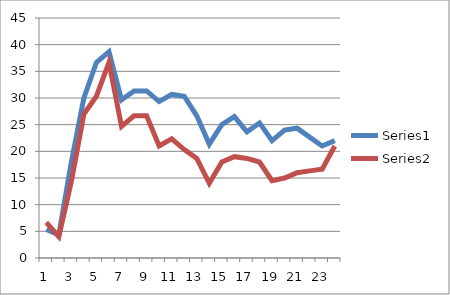
| Category | Series 0 | Series 1 |
|---|---|---|
| 0 | 5.333 | 6.667 |
| 1 | 4.333 | 4 |
| 2 | 18 | 14.333 |
| 3 | 30 | 27 |
| 4 | 36.667 | 30.333 |
| 5 | 38.667 | 36.667 |
| 6 | 29.667 | 24.667 |
| 7 | 31.333 | 26.667 |
| 8 | 31.333 | 26.667 |
| 9 | 29.333 | 21 |
| 10 | 30.667 | 22.333 |
| 11 | 30.333 | 20.333 |
| 12 | 26.667 | 18.667 |
| 13 | 21.333 | 14 |
| 14 | 25 | 18 |
| 15 | 26.5 | 19 |
| 16 | 23.667 | 18.667 |
| 17 | 25.333 | 18 |
| 18 | 22 | 14.5 |
| 19 | 24 | 15 |
| 20 | 24.333 | 16 |
| 21 | 22.667 | 16.333 |
| 22 | 21 | 16.667 |
| 23 | 22 | 21 |